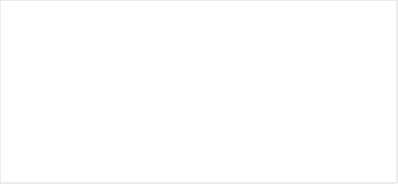
| Category | Series 0 |
|---|---|
| stajnjak | 0 |
| energetski usjevi | 0 |